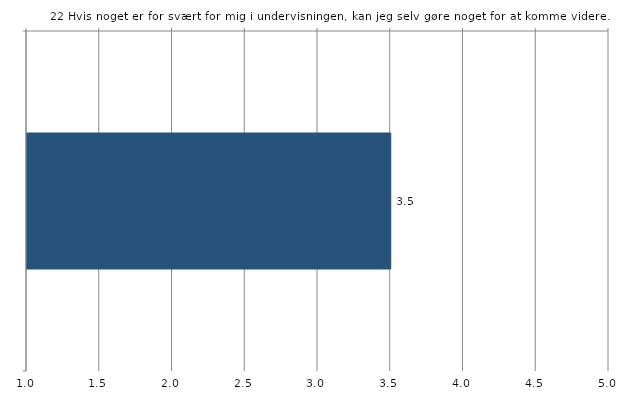
| Category | Gns. |
|---|---|
|   | 3.5 |